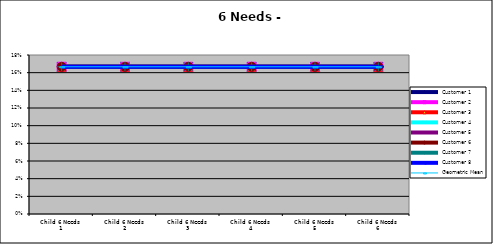
| Category | Customer 1 | Customer 2 | Customer 3 | Customer 4 | Customer 5 | Customer 6 | Customer 7 | Customer 8 | Geometric Mean |
|---|---|---|---|---|---|---|---|---|---|
| Child 6 Needs 1 | 0.167 | 0.167 | 0.167 | 0.167 | 0.167 | 0.167 | 0.167 | 0.167 | 0.167 |
| Child 6 Needs 2 | 0.167 | 0.167 | 0.167 | 0.167 | 0.167 | 0.167 | 0.167 | 0.167 | 0.167 |
| Child 6 Needs 3 | 0.167 | 0.167 | 0.167 | 0.167 | 0.167 | 0.167 | 0.167 | 0.167 | 0.167 |
| Child 6 Needs 4 | 0.167 | 0.167 | 0.167 | 0.167 | 0.167 | 0.167 | 0.167 | 0.167 | 0.167 |
| Child 6 Needs 5 | 0.167 | 0.167 | 0.167 | 0.167 | 0.167 | 0.167 | 0.167 | 0.167 | 0.167 |
| Child 6 Needs 6 | 0.167 | 0.167 | 0.167 | 0.167 | 0.167 | 0.167 | 0.167 | 0.167 | 0.167 |